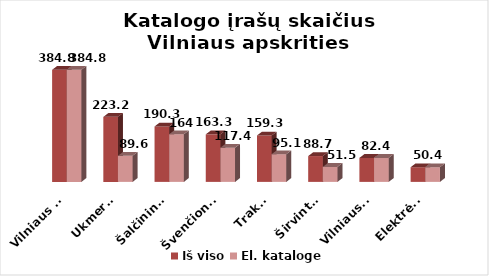
| Category | Iš viso | El. kataloge |
|---|---|---|
| Vilniaus m. | 384.8 | 384.8 |
| Ukmergė | 223.2 | 89.6 |
| Šalčininkai | 190.3 | 163.7 |
| Švenčionys | 163.3 | 117.4 |
| Trakai | 159.3 | 95.1 |
| Širvintos | 88.7 | 51.5 |
| Vilniaus r. | 82.4 | 82.4 |
| Elektrėnai | 50.4 | 50.4 |